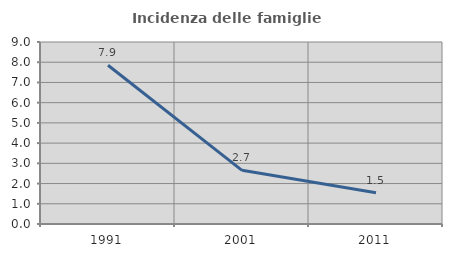
| Category | Incidenza delle famiglie numerose |
|---|---|
| 1991.0 | 7.851 |
| 2001.0 | 2.654 |
| 2011.0 | 1.549 |